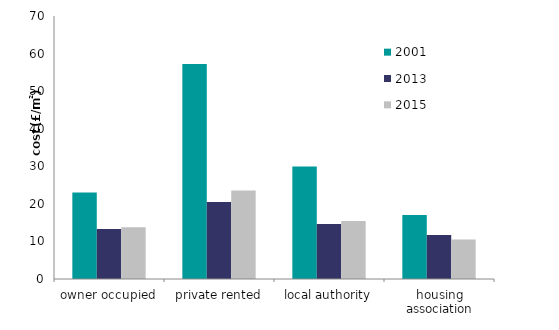
| Category | 2001 | 2013 | 2015 |
|---|---|---|---|
| owner occupied | 23.036 | 13.321 | 13.786 |
| private rented | 57.245 | 20.466 | 23.533 |
| local authority | 29.968 | 14.607 | 15.432 |
| housing association | 17.015 | 11.681 | 10.481 |